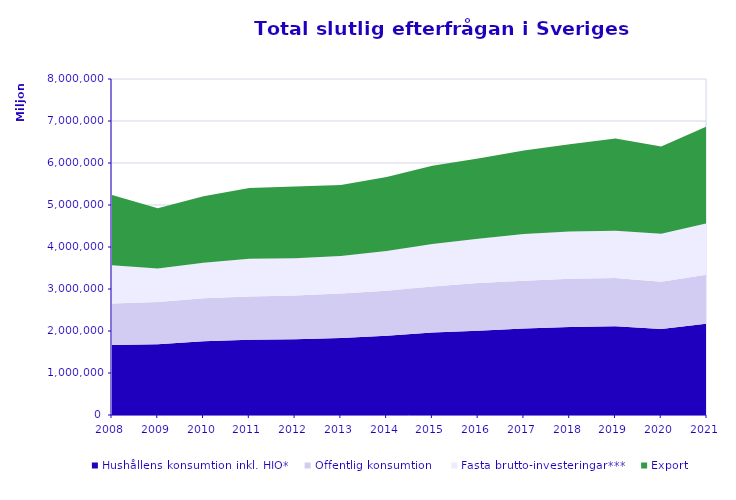
| Category | Hushållens konsumtion inkl. HIO* | Offentlig konsumtion | Fasta brutto-investeringar*** | Export |
|---|---|---|---|---|
| 2008.0 | 1666901 | 986883 | 913267 | 1671736 |
| 2009.0 | 1684204 | 1009101 | 797593 | 1430036 |
| 2010.0 | 1754421 | 1022388 | 847345 | 1582295 |
| 2011.0 | 1789341 | 1031256 | 897780 | 1688622 |
| 2012.0 | 1802428 | 1042589 | 888104 | 1707548 |
| 2013.0 | 1834754 | 1059178 | 892874 | 1688718 |
| 2014.0 | 1887573 | 1072391 | 946693 | 1762447 |
| 2015.0 | 1961665 | 1095716 | 1012008 | 1864670 |
| 2016.0 | 2006800 | 1136611 | 1052903 | 1909418 |
| 2017.0 | 2059110 | 1137995 | 1111301 | 1988308 |
| 2018.0 | 2097193 | 1147301 | 1126924 | 2072751 |
| 2019.0 | 2112297 | 1150364 | 1123128 | 2196577 |
| 2020.0 | 2045389 | 1129918 | 1141884 | 2076769 |
| 2021.0 | 2174766 | 1166872 | 1222950 | 2307776 |